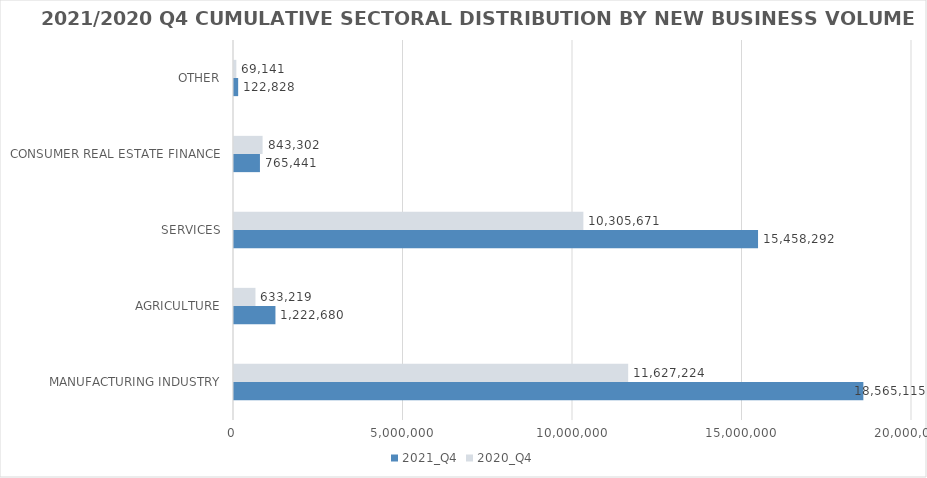
| Category | 2021_Q4 | 2020_Q4 |
|---|---|---|
| MANUFACTURING INDUSTRY | 18565115.311 | 11627224.274 |
| AGRICULTURE | 1222679.909 | 633218.575 |
| SERVICES | 15458292.017 | 10305671.197 |
| CONSUMER REAL ESTATE FINANCE | 765441 | 843302 |
| OTHER | 122828 | 69141.38 |